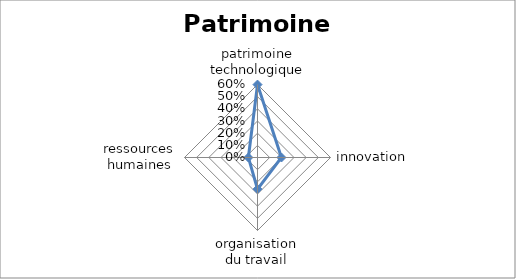
| Category | Series 0 |
|---|---|
| patrimoine technologique | 0.599 |
| innovation | 0.197 |
| organisation du travail | 0.26 |
| ressources humaines | 0.075 |